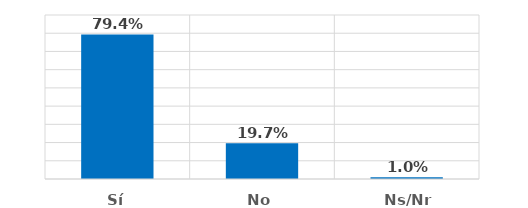
| Category | Series 0 |
|---|---|
| Sí | 0.794 |
| No | 0.197 |
| Ns/Nr | 0.01 |